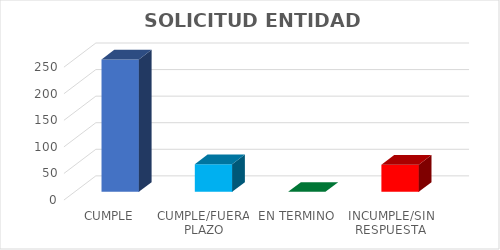
| Category | Series 0 |
|---|---|
| CUMPLE | 249 |
| CUMPLE/FUERA PLAZO | 52 |
| EN TERMINO | 0 |
| INCUMPLE/SIN RESPUESTA | 51 |